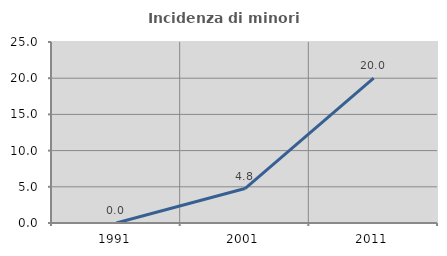
| Category | Incidenza di minori stranieri |
|---|---|
| 1991.0 | 0 |
| 2001.0 | 4.762 |
| 2011.0 | 20 |